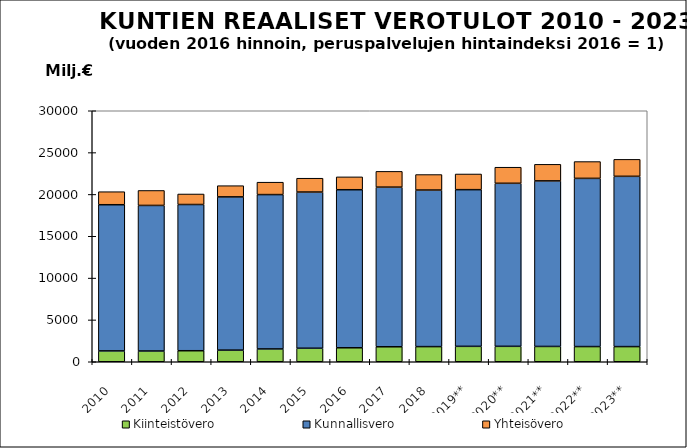
| Category | Kiinteistövero | Kunnallisvero | Yhteisövero |
|---|---|---|---|
| 2010 | 1296.352 | 17470.608 | 1559.108 |
| 2011 | 1285.841 | 17398.198 | 1789.548 |
| 2012 | 1317.524 | 17476.044 | 1257.689 |
| 2013 | 1389.588 | 18317.532 | 1337.058 |
| 2014 | 1532.817 | 18447.864 | 1481.581 |
| 2015 | 1616.418 | 18667.185 | 1654.236 |
| 2016 | 1669.703 | 18890.563 | 1537.872 |
| 2017 | 1790.628 | 19079.061 | 1886.129 |
| 2018 | 1809.209 | 18714.38 | 1852.755 |
| 2019** | 1843.158 | 18725.697 | 1872.57 |
| 2020** | 1844.83 | 19486.018 | 1921.698 |
| 2021** | 1828.921 | 19788.167 | 1979.759 |
| 2022** | 1814.891 | 20102.692 | 2009.343 |
| 2023** | 1810.449 | 20351.631 | 2028.795 |